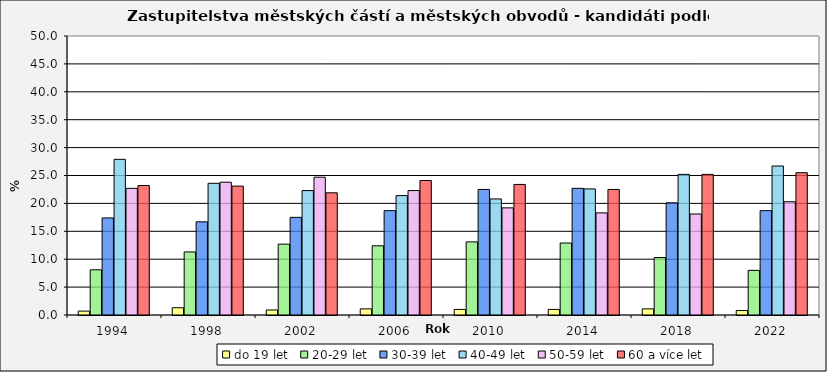
| Category | do 19 let | 20-29 let | 30-39 let | 40-49 let | 50-59 let | 60 a více let |
|---|---|---|---|---|---|---|
| 1994.0 | 0.7 | 8.1 | 17.4 | 27.9 | 22.7 | 23.2 |
| 1998.0 | 1.3 | 11.3 | 16.7 | 23.6 | 23.8 | 23.1 |
| 2002.0 | 0.9 | 12.7 | 17.5 | 22.3 | 24.7 | 21.9 |
| 2006.0 | 1.1 | 12.4 | 18.7 | 21.4 | 22.3 | 24.1 |
| 2010.0 | 1 | 13.1 | 22.5 | 20.8 | 19.2 | 23.4 |
| 2014.0 | 1 | 12.9 | 22.7 | 22.6 | 18.3 | 22.5 |
| 2018.0 | 1.1 | 10.3 | 20.1 | 25.2 | 18.1 | 25.2 |
| 2022.0 | 0.8 | 8 | 18.7 | 26.7 | 20.3 | 25.5 |